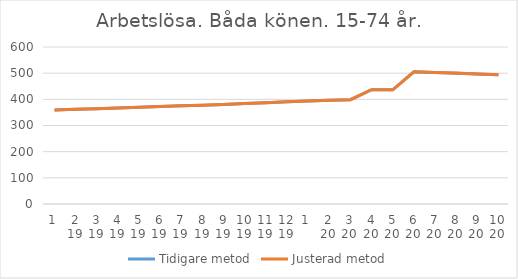
| Category | Tidigare metod | Justerad metod |
|---|---|---|
| 0 | 359.1 | 359.09 |
| 1 | 361.78 | 361.77 |
| 2 | 364.47 | 364.45 |
| 3 | 367.18 | 367.16 |
| 4 | 369.93 | 369.91 |
| 5 | 372.61 | 372.61 |
| 6 | 375.19 | 375.2 |
| 7 | 377.83 | 377.86 |
| 8 | 380.66 | 380.69 |
| 9 | 383.75 | 383.78 |
| 10 | 387.18 | 387.2 |
| 11 | 390.74 | 390.74 |
| 12 | 394.04 | 394.03 |
| 13 | 396.78 | 396.75 |
| 14 | 398.54 | 398.5 |
| 15 | 436.77 | 436.73 |
| 16 | 436.49 | 436.46 |
| 17 | 505.13 | 505.12 |
| 18 | 503 | 503.02 |
| 19 | 500.12 | 500.17 |
| 20 | 496.89 | 496.97 |
| 21 | 493.66 | 493.78 |